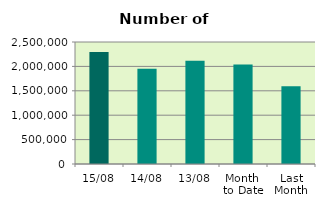
| Category | Series 0 |
|---|---|
| 15/08 | 2294194 |
| 14/08 | 1949478 |
| 13/08 | 2113594 |
| Month 
to Date | 2036963.636 |
| Last
Month | 1591495.826 |